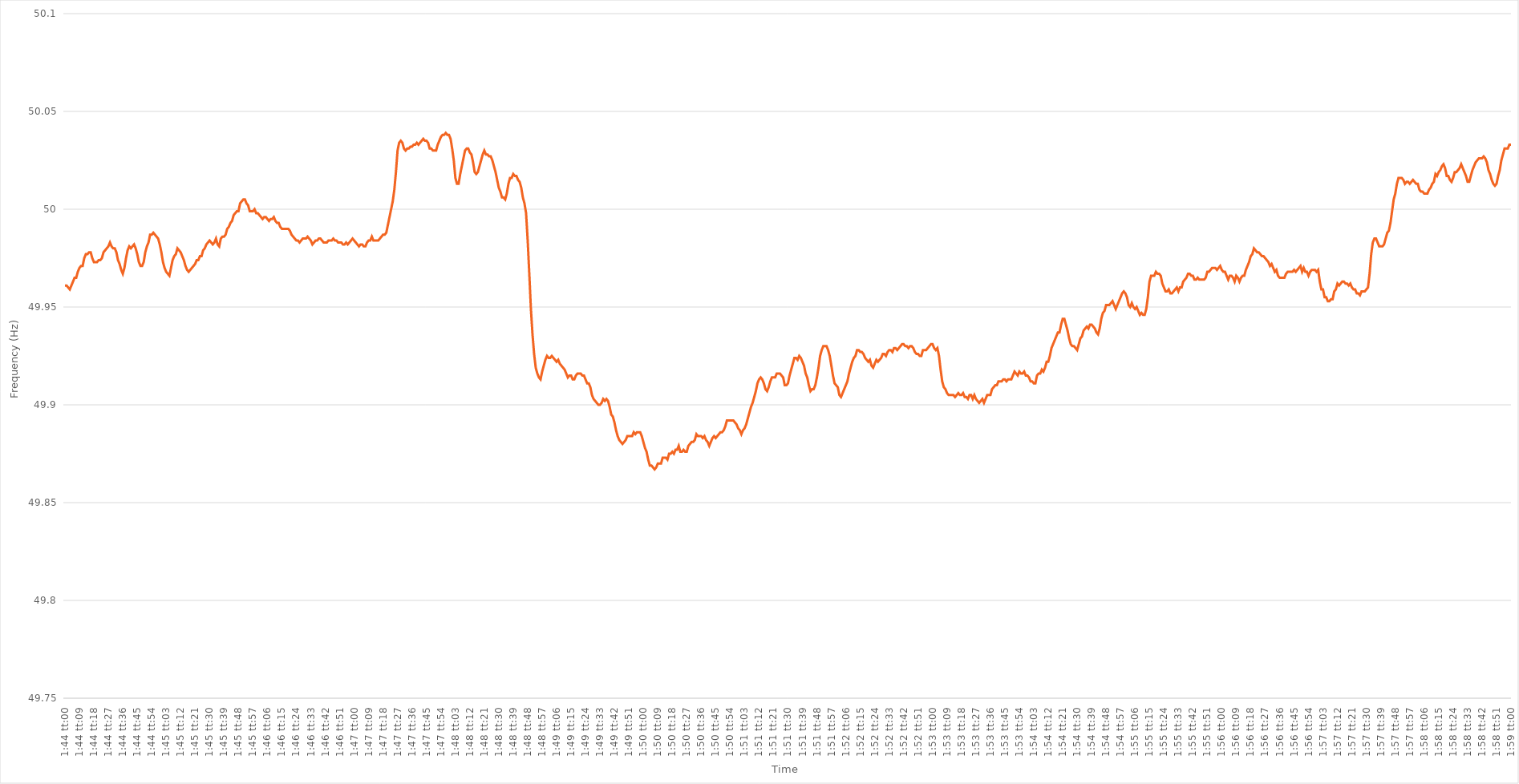
| Category | Series 0 |
|---|---|
| 0.07222222222222223 | 49.961 |
| 0.0722337962962963 | 49.961 |
| 0.07224537037037036 | 49.96 |
| 0.07225694444444444 | 49.959 |
| 0.07226851851851852 | 49.961 |
| 0.07228009259259259 | 49.963 |
| 0.07229166666666666 | 49.965 |
| 0.07230324074074074 | 49.965 |
| 0.07231481481481482 | 49.968 |
| 0.07232638888888888 | 49.97 |
| 0.07233796296296297 | 49.971 |
| 0.07234953703703705 | 49.971 |
| 0.07236111111111111 | 49.975 |
| 0.07237268518518519 | 49.977 |
| 0.07238425925925926 | 49.977 |
| 0.07239583333333334 | 49.978 |
| 0.0724074074074074 | 49.978 |
| 0.07241898148148147 | 49.975 |
| 0.07243055555555555 | 49.973 |
| 0.07244212962962963 | 49.973 |
| 0.0724537037037037 | 49.973 |
| 0.07246527777777778 | 49.974 |
| 0.07247685185185186 | 49.974 |
| 0.07248842592592593 | 49.975 |
| 0.0725 | 49.978 |
| 0.07251157407407406 | 49.979 |
| 0.07252314814814814 | 49.98 |
| 0.07253472222222222 | 49.981 |
| 0.07254629629629629 | 49.983 |
| 0.07255787037037037 | 49.981 |
| 0.07256944444444445 | 49.98 |
| 0.07258101851851852 | 49.98 |
| 0.0725925925925926 | 49.978 |
| 0.07260416666666666 | 49.974 |
| 0.07261574074074074 | 49.972 |
| 0.07262731481481481 | 49.969 |
| 0.07263888888888889 | 49.967 |
| 0.07265046296296296 | 49.97 |
| 0.07266203703703704 | 49.975 |
| 0.0726736111111111 | 49.979 |
| 0.07268518518518519 | 49.981 |
| 0.07269675925925927 | 49.98 |
| 0.07270833333333333 | 49.981 |
| 0.07271990740740741 | 49.982 |
| 0.07273148148148148 | 49.98 |
| 0.07274305555555556 | 49.977 |
| 0.07275462962962963 | 49.973 |
| 0.0727662037037037 | 49.971 |
| 0.07277777777777777 | 49.971 |
| 0.07278935185185186 | 49.973 |
| 0.07280092592592592 | 49.978 |
| 0.0728125 | 49.981 |
| 0.07282407407407408 | 49.983 |
| 0.07283564814814815 | 49.987 |
| 0.07284722222222222 | 49.987 |
| 0.0728587962962963 | 49.988 |
| 0.07287037037037036 | 49.987 |
| 0.07288194444444444 | 49.986 |
| 0.07289351851851851 | 49.985 |
| 0.07290509259259259 | 49.982 |
| 0.07291666666666667 | 49.978 |
| 0.07292824074074074 | 49.973 |
| 0.07293981481481482 | 49.97 |
| 0.07295138888888889 | 49.968 |
| 0.07296296296296297 | 49.967 |
| 0.07297453703703703 | 49.966 |
| 0.07298611111111111 | 49.97 |
| 0.07299768518518518 | 49.974 |
| 0.07300925925925926 | 49.976 |
| 0.07302083333333333 | 49.977 |
| 0.07303240740740741 | 49.98 |
| 0.07304398148148149 | 49.979 |
| 0.07305555555555555 | 49.978 |
| 0.07306712962962963 | 49.976 |
| 0.07307870370370372 | 49.974 |
| 0.07309027777777778 | 49.971 |
| 0.07310185185185185 | 49.969 |
| 0.07311342592592592 | 49.968 |
| 0.073125 | 49.969 |
| 0.07313657407407408 | 49.97 |
| 0.07314814814814814 | 49.971 |
| 0.07315972222222222 | 49.972 |
| 0.0731712962962963 | 49.974 |
| 0.07318287037037037 | 49.974 |
| 0.07319444444444444 | 49.976 |
| 0.07320601851851852 | 49.976 |
| 0.07321759259259258 | 49.979 |
| 0.07322916666666666 | 49.98 |
| 0.07324074074074073 | 49.982 |
| 0.07325231481481481 | 49.983 |
| 0.07326388888888889 | 49.984 |
| 0.07327546296296296 | 49.983 |
| 0.07328703703703704 | 49.982 |
| 0.07329861111111112 | 49.983 |
| 0.07331018518518519 | 49.985 |
| 0.07332175925925927 | 49.982 |
| 0.07333333333333333 | 49.981 |
| 0.07334490740740741 | 49.985 |
| 0.07335648148148148 | 49.986 |
| 0.07336805555555555 | 49.986 |
| 0.07337962962962963 | 49.987 |
| 0.07339120370370371 | 49.99 |
| 0.07340277777777778 | 49.991 |
| 0.07341435185185186 | 49.993 |
| 0.07342592592592594 | 49.994 |
| 0.0734375 | 49.997 |
| 0.07344907407407407 | 49.998 |
| 0.07346064814814814 | 49.999 |
| 0.07347222222222222 | 49.999 |
| 0.0734837962962963 | 50.003 |
| 0.07349537037037036 | 50.004 |
| 0.07350694444444444 | 50.005 |
| 0.07351851851851852 | 50.005 |
| 0.07353009259259259 | 50.003 |
| 0.07354166666666667 | 50.002 |
| 0.07355324074074074 | 49.999 |
| 0.07356481481481482 | 49.999 |
| 0.07357638888888889 | 49.999 |
| 0.07358796296296297 | 50 |
| 0.07359953703703703 | 49.998 |
| 0.07361111111111111 | 49.998 |
| 0.07362268518518518 | 49.997 |
| 0.07363425925925926 | 49.996 |
| 0.07364583333333334 | 49.995 |
| 0.07365740740740741 | 49.996 |
| 0.07366898148148149 | 49.996 |
| 0.07368055555555555 | 49.995 |
| 0.07369212962962964 | 49.994 |
| 0.0737037037037037 | 49.995 |
| 0.07371527777777777 | 49.995 |
| 0.07372685185185185 | 49.996 |
| 0.07373842592592593 | 49.994 |
| 0.07375 | 49.993 |
| 0.07376157407407408 | 49.993 |
| 0.07377314814814816 | 49.991 |
| 0.07378472222222222 | 49.99 |
| 0.07379629629629629 | 49.99 |
| 0.07380787037037037 | 49.99 |
| 0.07381944444444444 | 49.99 |
| 0.07383101851851852 | 49.99 |
| 0.07384259259259258 | 49.989 |
| 0.07385416666666667 | 49.987 |
| 0.07386574074074075 | 49.986 |
| 0.07387731481481481 | 49.985 |
| 0.07388888888888889 | 49.984 |
| 0.07390046296296296 | 49.984 |
| 0.07391203703703704 | 49.983 |
| 0.0739236111111111 | 49.984 |
| 0.07393518518518519 | 49.985 |
| 0.07394675925925925 | 49.985 |
| 0.07395833333333333 | 49.985 |
| 0.0739699074074074 | 49.986 |
| 0.07398148148148148 | 49.985 |
| 0.07399305555555556 | 49.984 |
| 0.07400462962962963 | 49.982 |
| 0.07401620370370371 | 49.983 |
| 0.07402777777777779 | 49.984 |
| 0.07403935185185186 | 49.984 |
| 0.07405092592592592 | 49.985 |
| 0.07406249999999999 | 49.985 |
| 0.07407407407407407 | 49.984 |
| 0.07408564814814815 | 49.983 |
| 0.07409722222222222 | 49.983 |
| 0.0741087962962963 | 49.983 |
| 0.07412037037037038 | 49.984 |
| 0.07413194444444444 | 49.984 |
| 0.07414351851851851 | 49.984 |
| 0.07415509259259259 | 49.985 |
| 0.07416666666666666 | 49.984 |
| 0.07417824074074074 | 49.984 |
| 0.0741898148148148 | 49.983 |
| 0.07420138888888889 | 49.983 |
| 0.07421296296296297 | 49.983 |
| 0.07422453703703703 | 49.982 |
| 0.07423611111111111 | 49.982 |
| 0.0742476851851852 | 49.983 |
| 0.07425925925925926 | 49.982 |
| 0.07427083333333334 | 49.983 |
| 0.07428240740740741 | 49.984 |
| 0.07429398148148149 | 49.985 |
| 0.07430555555555556 | 49.984 |
| 0.07431712962962962 | 49.983 |
| 0.0743287037037037 | 49.982 |
| 0.07434027777777778 | 49.981 |
| 0.07435185185185185 | 49.982 |
| 0.07436342592592593 | 49.982 |
| 0.07437500000000001 | 49.981 |
| 0.07438657407407408 | 49.981 |
| 0.07439814814814814 | 49.983 |
| 0.07440972222222221 | 49.984 |
| 0.07442129629629629 | 49.984 |
| 0.07443287037037037 | 49.986 |
| 0.07444444444444444 | 49.984 |
| 0.07445601851851852 | 49.984 |
| 0.0744675925925926 | 49.984 |
| 0.07447916666666667 | 49.984 |
| 0.07449074074074075 | 49.985 |
| 0.07450231481481481 | 49.986 |
| 0.0745138888888889 | 49.987 |
| 0.07452546296296296 | 49.987 |
| 0.07453703703703704 | 49.988 |
| 0.07454861111111111 | 49.992 |
| 0.07456018518518519 | 49.996 |
| 0.07457175925925925 | 50 |
| 0.07458333333333333 | 50.004 |
| 0.07459490740740742 | 50.01 |
| 0.07460648148148148 | 50.019 |
| 0.07461805555555556 | 50.03 |
| 0.07462962962962963 | 50.034 |
| 0.07464120370370371 | 50.035 |
| 0.07465277777777778 | 50.034 |
| 0.07466435185185184 | 50.031 |
| 0.07467592592592592 | 50.03 |
| 0.0746875 | 50.031 |
| 0.07469907407407407 | 50.031 |
| 0.07471064814814815 | 50.032 |
| 0.07472222222222223 | 50.032 |
| 0.0747337962962963 | 50.033 |
| 0.07474537037037036 | 50.033 |
| 0.07475694444444445 | 50.034 |
| 0.07476851851851851 | 50.033 |
| 0.07478009259259259 | 50.034 |
| 0.07479166666666666 | 50.035 |
| 0.07480324074074074 | 50.036 |
| 0.07481481481481482 | 50.035 |
| 0.07482638888888889 | 50.035 |
| 0.07483796296296297 | 50.034 |
| 0.07484953703703703 | 50.031 |
| 0.07486111111111111 | 50.031 |
| 0.07487268518518518 | 50.03 |
| 0.07488425925925926 | 50.03 |
| 0.07489583333333333 | 50.03 |
| 0.07490740740740741 | 50.033 |
| 0.07491898148148148 | 50.035 |
| 0.07493055555555556 | 50.037 |
| 0.07494212962962964 | 50.038 |
| 0.0749537037037037 | 50.038 |
| 0.07496527777777778 | 50.039 |
| 0.07497685185185186 | 50.038 |
| 0.07498842592592593 | 50.038 |
| 0.075 | 50.036 |
| 0.07501157407407406 | 50.031 |
| 0.07502314814814814 | 50.025 |
| 0.07503472222222222 | 50.016 |
| 0.07504629629629629 | 50.013 |
| 0.07505787037037037 | 50.013 |
| 0.07506944444444445 | 50.018 |
| 0.07508101851851852 | 50.022 |
| 0.07509259259259259 | 50.026 |
| 0.07510416666666667 | 50.03 |
| 0.07511574074074073 | 50.031 |
| 0.07512731481481481 | 50.031 |
| 0.07513888888888888 | 50.029 |
| 0.07515046296296296 | 50.028 |
| 0.07516203703703704 | 50.024 |
| 0.07517361111111111 | 50.019 |
| 0.07518518518518519 | 50.018 |
| 0.07519675925925927 | 50.019 |
| 0.07520833333333334 | 50.022 |
| 0.07521990740740742 | 50.025 |
| 0.07523148148148148 | 50.028 |
| 0.07524305555555556 | 50.03 |
| 0.07525462962962963 | 50.028 |
| 0.0752662037037037 | 50.028 |
| 0.07527777777777778 | 50.027 |
| 0.07528935185185186 | 50.027 |
| 0.07530092592592592 | 50.025 |
| 0.0753125 | 50.022 |
| 0.07532407407407408 | 50.019 |
| 0.07533564814814815 | 50.015 |
| 0.07534722222222222 | 50.011 |
| 0.07535879629629628 | 50.009 |
| 0.07537037037037037 | 50.006 |
| 0.07538194444444445 | 50.006 |
| 0.07539351851851851 | 50.005 |
| 0.07540509259259259 | 50.008 |
| 0.07541666666666667 | 50.013 |
| 0.07542824074074074 | 50.016 |
| 0.07543981481481482 | 50.016 |
| 0.07545138888888889 | 50.018 |
| 0.07546296296296297 | 50.017 |
| 0.07547453703703703 | 50.017 |
| 0.07548611111111111 | 50.015 |
| 0.07549768518518518 | 50.014 |
| 0.07550925925925926 | 50.011 |
| 0.07552083333333333 | 50.006 |
| 0.07553240740740741 | 50.003 |
| 0.07554398148148149 | 49.998 |
| 0.07555555555555556 | 49.984 |
| 0.07556712962962964 | 49.967 |
| 0.0755787037037037 | 49.949 |
| 0.07559027777777778 | 49.936 |
| 0.07560185185185185 | 49.926 |
| 0.07561342592592592 | 49.919 |
| 0.075625 | 49.916 |
| 0.07563657407407408 | 49.914 |
| 0.07564814814814814 | 49.913 |
| 0.07565972222222223 | 49.917 |
| 0.0756712962962963 | 49.92 |
| 0.07568287037037037 | 49.923 |
| 0.07569444444444444 | 49.925 |
| 0.07570601851851852 | 49.924 |
| 0.07571759259259259 | 49.924 |
| 0.07572916666666667 | 49.925 |
| 0.07574074074074073 | 49.924 |
| 0.07575231481481481 | 49.923 |
| 0.0757638888888889 | 49.922 |
| 0.07577546296296296 | 49.923 |
| 0.07578703703703704 | 49.921 |
| 0.07579861111111111 | 49.92 |
| 0.07581018518518519 | 49.919 |
| 0.07582175925925926 | 49.918 |
| 0.07583333333333334 | 49.916 |
| 0.0758449074074074 | 49.914 |
| 0.07585648148148148 | 49.915 |
| 0.07586805555555555 | 49.915 |
| 0.07587962962962963 | 49.913 |
| 0.07589120370370371 | 49.913 |
| 0.07590277777777778 | 49.915 |
| 0.07591435185185186 | 49.916 |
| 0.07592592592592594 | 49.916 |
| 0.0759375 | 49.916 |
| 0.07594907407407407 | 49.915 |
| 0.07596064814814814 | 49.915 |
| 0.07597222222222222 | 49.913 |
| 0.0759837962962963 | 49.911 |
| 0.07599537037037037 | 49.911 |
| 0.07600694444444445 | 49.909 |
| 0.07601851851851853 | 49.905 |
| 0.0760300925925926 | 49.903 |
| 0.07604166666666666 | 49.902 |
| 0.07605324074074074 | 49.901 |
| 0.07606481481481481 | 49.9 |
| 0.07607638888888889 | 49.9 |
| 0.07608796296296295 | 49.901 |
| 0.07609953703703703 | 49.903 |
| 0.07611111111111112 | 49.902 |
| 0.07612268518518518 | 49.903 |
| 0.07613425925925926 | 49.902 |
| 0.07614583333333334 | 49.899 |
| 0.07615740740740741 | 49.895 |
| 0.07616898148148148 | 49.894 |
| 0.07618055555555556 | 49.891 |
| 0.07619212962962964 | 49.887 |
| 0.0762037037037037 | 49.884 |
| 0.07621527777777777 | 49.882 |
| 0.07622685185185185 | 49.881 |
| 0.07623842592592593 | 49.88 |
| 0.07625 | 49.881 |
| 0.07626157407407408 | 49.882 |
| 0.07627314814814816 | 49.884 |
| 0.07628472222222223 | 49.884 |
| 0.07629629629629629 | 49.884 |
| 0.07630787037037036 | 49.884 |
| 0.07631944444444444 | 49.886 |
| 0.07633101851851852 | 49.885 |
| 0.07634259259259259 | 49.886 |
| 0.07635416666666667 | 49.886 |
| 0.07636574074074075 | 49.886 |
| 0.07637731481481481 | 49.884 |
| 0.0763888888888889 | 49.881 |
| 0.07640046296296296 | 49.878 |
| 0.07641203703703704 | 49.876 |
| 0.07642361111111111 | 49.872 |
| 0.07643518518518519 | 49.869 |
| 0.07644675925925926 | 49.869 |
| 0.07645833333333334 | 49.868 |
| 0.0764699074074074 | 49.867 |
| 0.07648148148148148 | 49.868 |
| 0.07649305555555556 | 49.87 |
| 0.07650462962962963 | 49.87 |
| 0.0765162037037037 | 49.87 |
| 0.07652777777777778 | 49.873 |
| 0.07653935185185186 | 49.873 |
| 0.07655092592592593 | 49.873 |
| 0.07656249999999999 | 49.872 |
| 0.07657407407407407 | 49.875 |
| 0.07658564814814815 | 49.875 |
| 0.07659722222222222 | 49.876 |
| 0.0766087962962963 | 49.875 |
| 0.07662037037037038 | 49.877 |
| 0.07663194444444445 | 49.877 |
| 0.07664351851851851 | 49.879 |
| 0.0766550925925926 | 49.876 |
| 0.07666666666666666 | 49.876 |
| 0.07667824074074074 | 49.877 |
| 0.07668981481481481 | 49.876 |
| 0.07670138888888889 | 49.876 |
| 0.07671296296296297 | 49.879 |
| 0.07672453703703704 | 49.88 |
| 0.07673611111111112 | 49.881 |
| 0.07674768518518518 | 49.881 |
| 0.07675925925925926 | 49.882 |
| 0.07677083333333333 | 49.885 |
| 0.07678240740740741 | 49.884 |
| 0.07679398148148148 | 49.884 |
| 0.07680555555555556 | 49.884 |
| 0.07681712962962962 | 49.883 |
| 0.0768287037037037 | 49.884 |
| 0.07684027777777779 | 49.882 |
| 0.07685185185185185 | 49.881 |
| 0.07686342592592592 | 49.879 |
| 0.07687500000000001 | 49.881 |
| 0.07688657407407408 | 49.883 |
| 0.07689814814814815 | 49.884 |
| 0.07690972222222221 | 49.883 |
| 0.0769212962962963 | 49.884 |
| 0.07693287037037037 | 49.885 |
| 0.07694444444444444 | 49.886 |
| 0.07695601851851852 | 49.886 |
| 0.0769675925925926 | 49.887 |
| 0.07697916666666667 | 49.889 |
| 0.07699074074074073 | 49.892 |
| 0.07700231481481482 | 49.892 |
| 0.07701388888888888 | 49.892 |
| 0.07702546296296296 | 49.892 |
| 0.07703703703703703 | 49.892 |
| 0.07704861111111111 | 49.891 |
| 0.07706018518518519 | 49.89 |
| 0.07707175925925926 | 49.888 |
| 0.07708333333333334 | 49.887 |
| 0.07709490740740742 | 49.885 |
| 0.07710648148148148 | 49.887 |
| 0.07711805555555555 | 49.888 |
| 0.07712962962962963 | 49.89 |
| 0.07714120370370371 | 49.893 |
| 0.07715277777777778 | 49.896 |
| 0.07716435185185185 | 49.899 |
| 0.07717592592592593 | 49.901 |
| 0.0771875 | 49.904 |
| 0.07719907407407407 | 49.907 |
| 0.07721064814814814 | 49.911 |
| 0.07722222222222223 | 49.913 |
| 0.0772337962962963 | 49.914 |
| 0.07724537037037037 | 49.913 |
| 0.07725694444444443 | 49.911 |
| 0.07726851851851851 | 49.908 |
| 0.0772800925925926 | 49.907 |
| 0.07729166666666666 | 49.909 |
| 0.07730324074074074 | 49.912 |
| 0.07731481481481482 | 49.914 |
| 0.07732638888888889 | 49.914 |
| 0.07733796296296297 | 49.914 |
| 0.07734953703703704 | 49.916 |
| 0.07736111111111112 | 49.916 |
| 0.07737268518518518 | 49.916 |
| 0.07738425925925925 | 49.915 |
| 0.07739583333333333 | 49.914 |
| 0.07740740740740741 | 49.91 |
| 0.07741898148148148 | 49.91 |
| 0.07743055555555556 | 49.911 |
| 0.07744212962962964 | 49.915 |
| 0.0774537037037037 | 49.918 |
| 0.07746527777777777 | 49.921 |
| 0.07747685185185185 | 49.924 |
| 0.07748842592592593 | 49.924 |
| 0.0775 | 49.923 |
| 0.07751157407407407 | 49.925 |
| 0.07752314814814815 | 49.924 |
| 0.07753472222222223 | 49.922 |
| 0.0775462962962963 | 49.92 |
| 0.07755787037037037 | 49.916 |
| 0.07756944444444445 | 49.914 |
| 0.07758101851851852 | 49.91 |
| 0.07759259259259259 | 49.907 |
| 0.07760416666666667 | 49.908 |
| 0.07761574074074074 | 49.908 |
| 0.07762731481481482 | 49.91 |
| 0.07763888888888888 | 49.914 |
| 0.07765046296296296 | 49.919 |
| 0.07766203703703704 | 49.925 |
| 0.07767361111111111 | 49.928 |
| 0.07768518518518519 | 49.93 |
| 0.07769675925925926 | 49.93 |
| 0.07770833333333334 | 49.93 |
| 0.0777199074074074 | 49.928 |
| 0.07773148148148147 | 49.925 |
| 0.07774305555555555 | 49.92 |
| 0.07775462962962963 | 49.915 |
| 0.0777662037037037 | 49.911 |
| 0.07777777777777778 | 49.91 |
| 0.07778935185185186 | 49.909 |
| 0.07780092592592593 | 49.905 |
| 0.07781249999999999 | 49.904 |
| 0.07782407407407409 | 49.906 |
| 0.07783564814814815 | 49.908 |
| 0.07784722222222222 | 49.91 |
| 0.07785879629629629 | 49.912 |
| 0.07787037037037037 | 49.916 |
| 0.07788194444444445 | 49.919 |
| 0.07789351851851851 | 49.922 |
| 0.0779050925925926 | 49.924 |
| 0.07791666666666668 | 49.925 |
| 0.07792824074074074 | 49.928 |
| 0.07793981481481481 | 49.928 |
| 0.07795138888888889 | 49.927 |
| 0.07796296296296296 | 49.927 |
| 0.07797453703703704 | 49.926 |
| 0.0779861111111111 | 49.924 |
| 0.07799768518518518 | 49.923 |
| 0.07800925925925926 | 49.922 |
| 0.07802083333333333 | 49.923 |
| 0.07803240740740741 | 49.92 |
| 0.07804398148148149 | 49.919 |
| 0.07805555555555556 | 49.921 |
| 0.07806712962962963 | 49.923 |
| 0.07807870370370369 | 49.922 |
| 0.07809027777777779 | 49.923 |
| 0.07810185185185185 | 49.924 |
| 0.07811342592592592 | 49.926 |
| 0.078125 | 49.926 |
| 0.07813657407407408 | 49.925 |
| 0.07814814814814815 | 49.927 |
| 0.07815972222222221 | 49.928 |
| 0.07817129629629631 | 49.928 |
| 0.07818287037037037 | 49.927 |
| 0.07819444444444444 | 49.929 |
| 0.07820601851851851 | 49.929 |
| 0.07821759259259259 | 49.928 |
| 0.07822916666666667 | 49.929 |
| 0.07824074074074074 | 49.93 |
| 0.07825231481481482 | 49.931 |
| 0.0782638888888889 | 49.931 |
| 0.07827546296296296 | 49.93 |
| 0.07828703703703704 | 49.93 |
| 0.07829861111111111 | 49.929 |
| 0.07831018518518519 | 49.93 |
| 0.07832175925925926 | 49.93 |
| 0.07833333333333332 | 49.929 |
| 0.0783449074074074 | 49.927 |
| 0.07835648148148149 | 49.926 |
| 0.07836805555555555 | 49.926 |
| 0.07837962962962963 | 49.925 |
| 0.07839120370370371 | 49.925 |
| 0.07840277777777778 | 49.928 |
| 0.07841435185185185 | 49.928 |
| 0.07842592592592591 | 49.928 |
| 0.07843750000000001 | 49.929 |
| 0.07844907407407407 | 49.93 |
| 0.07846064814814814 | 49.931 |
| 0.07847222222222222 | 49.931 |
| 0.0784837962962963 | 49.929 |
| 0.07849537037037037 | 49.928 |
| 0.07850694444444445 | 49.929 |
| 0.07851851851851853 | 49.925 |
| 0.0785300925925926 | 49.918 |
| 0.07854166666666666 | 49.912 |
| 0.07855324074074074 | 49.909 |
| 0.07856481481481481 | 49.908 |
| 0.07857638888888889 | 49.906 |
| 0.07858796296296296 | 49.905 |
| 0.07859953703703704 | 49.905 |
| 0.07861111111111112 | 49.905 |
| 0.07862268518518518 | 49.905 |
| 0.07863425925925926 | 49.904 |
| 0.07864583333333333 | 49.905 |
| 0.07865740740740741 | 49.906 |
| 0.07866898148148148 | 49.905 |
| 0.07868055555555555 | 49.905 |
| 0.07869212962962963 | 49.906 |
| 0.0787037037037037 | 49.904 |
| 0.07871527777777777 | 49.904 |
| 0.07872685185185185 | 49.903 |
| 0.07873842592592593 | 49.905 |
| 0.07875 | 49.905 |
| 0.07876157407407407 | 49.903 |
| 0.07877314814814815 | 49.905 |
| 0.07878472222222223 | 49.903 |
| 0.0787962962962963 | 49.902 |
| 0.07880787037037036 | 49.901 |
| 0.07881944444444444 | 49.902 |
| 0.07883101851851852 | 49.903 |
| 0.07884259259259259 | 49.901 |
| 0.07885416666666667 | 49.903 |
| 0.07886574074074075 | 49.905 |
| 0.07887731481481482 | 49.905 |
| 0.07888888888888888 | 49.905 |
| 0.07890046296296296 | 49.908 |
| 0.07891203703703703 | 49.909 |
| 0.07892361111111111 | 49.91 |
| 0.07893518518518518 | 49.91 |
| 0.07894675925925926 | 49.912 |
| 0.07895833333333334 | 49.912 |
| 0.0789699074074074 | 49.912 |
| 0.07898148148148149 | 49.913 |
| 0.07899305555555557 | 49.913 |
| 0.07900462962962963 | 49.912 |
| 0.0790162037037037 | 49.913 |
| 0.07902777777777777 | 49.913 |
| 0.07903935185185186 | 49.913 |
| 0.07905092592592593 | 49.915 |
| 0.0790625 | 49.917 |
| 0.07907407407407407 | 49.916 |
| 0.07908564814814815 | 49.915 |
| 0.07909722222222222 | 49.917 |
| 0.07910879629629629 | 49.916 |
| 0.07912037037037037 | 49.916 |
| 0.07913194444444445 | 49.917 |
| 0.07914351851851852 | 49.915 |
| 0.07915509259259258 | 49.915 |
| 0.07916666666666666 | 49.914 |
| 0.07917824074074074 | 49.912 |
| 0.07918981481481481 | 49.912 |
| 0.07920138888888889 | 49.911 |
| 0.07921296296296297 | 49.911 |
| 0.07922453703703704 | 49.915 |
| 0.07923611111111112 | 49.916 |
| 0.07924768518518518 | 49.916 |
| 0.07925925925925927 | 49.918 |
| 0.07927083333333333 | 49.917 |
| 0.0792824074074074 | 49.919 |
| 0.07929398148148148 | 49.922 |
| 0.07930555555555556 | 49.922 |
| 0.07931712962962963 | 49.925 |
| 0.0793287037037037 | 49.929 |
| 0.07934027777777779 | 49.931 |
| 0.07935185185185185 | 49.933 |
| 0.07936342592592592 | 49.935 |
| 0.07937499999999999 | 49.937 |
| 0.07938657407407408 | 49.937 |
| 0.07939814814814815 | 49.941 |
| 0.07940972222222221 | 49.944 |
| 0.0794212962962963 | 49.944 |
| 0.07943287037037038 | 49.941 |
| 0.07944444444444444 | 49.938 |
| 0.07945601851851852 | 49.934 |
| 0.07946759259259259 | 49.931 |
| 0.07947916666666667 | 49.93 |
| 0.07949074074074074 | 49.93 |
| 0.07950231481481482 | 49.929 |
| 0.07951388888888888 | 49.928 |
| 0.07952546296296296 | 49.931 |
| 0.07953703703703703 | 49.934 |
| 0.07954861111111111 | 49.935 |
| 0.07956018518518519 | 49.938 |
| 0.07957175925925926 | 49.939 |
| 0.07958333333333334 | 49.94 |
| 0.0795949074074074 | 49.939 |
| 0.07960648148148149 | 49.941 |
| 0.07961805555555555 | 49.941 |
| 0.07962962962962962 | 49.94 |
| 0.0796412037037037 | 49.939 |
| 0.07965277777777778 | 49.937 |
| 0.07966435185185185 | 49.936 |
| 0.07967592592592593 | 49.939 |
| 0.07968750000000001 | 49.944 |
| 0.07969907407407407 | 49.947 |
| 0.07971064814814814 | 49.948 |
| 0.07972222222222222 | 49.951 |
| 0.0797337962962963 | 49.951 |
| 0.07974537037037037 | 49.951 |
| 0.07975694444444444 | 49.952 |
| 0.07976851851851852 | 49.953 |
| 0.0797800925925926 | 49.951 |
| 0.07979166666666666 | 49.949 |
| 0.07980324074074074 | 49.951 |
| 0.07981481481481481 | 49.953 |
| 0.07982638888888889 | 49.955 |
| 0.07983796296296296 | 49.957 |
| 0.07984953703703704 | 49.958 |
| 0.0798611111111111 | 49.957 |
| 0.07987268518518519 | 49.955 |
| 0.07988425925925925 | 49.951 |
| 0.07989583333333333 | 49.95 |
| 0.07990740740740741 | 49.952 |
| 0.07991898148148148 | 49.95 |
| 0.07993055555555556 | 49.949 |
| 0.07994212962962964 | 49.95 |
| 0.07995370370370371 | 49.948 |
| 0.07996527777777777 | 49.946 |
| 0.07997685185185184 | 49.947 |
| 0.07998842592592592 | 49.946 |
| 0.08 | 49.946 |
| 0.08001157407407407 | 49.949 |
| 0.08002314814814815 | 49.955 |
| 0.08003472222222223 | 49.963 |
| 0.0800462962962963 | 49.966 |
| 0.08005787037037036 | 49.966 |
| 0.08006944444444444 | 49.966 |
| 0.08008101851851852 | 49.968 |
| 0.08009259259259259 | 49.967 |
| 0.08010416666666666 | 49.967 |
| 0.08011574074074074 | 49.966 |
| 0.08012731481481482 | 49.962 |
| 0.08013888888888888 | 49.96 |
| 0.08015046296296297 | 49.958 |
| 0.08016203703703705 | 49.958 |
| 0.08017361111111111 | 49.959 |
| 0.08018518518518519 | 49.957 |
| 0.08019675925925926 | 49.957 |
| 0.08020833333333334 | 49.958 |
| 0.0802199074074074 | 49.959 |
| 0.08023148148148147 | 49.96 |
| 0.08024305555555555 | 49.958 |
| 0.08025462962962963 | 49.96 |
| 0.0802662037037037 | 49.96 |
| 0.08027777777777778 | 49.963 |
| 0.08028935185185186 | 49.964 |
| 0.08030092592592593 | 49.965 |
| 0.0803125 | 49.967 |
| 0.08032407407407406 | 49.967 |
| 0.08033564814814814 | 49.966 |
| 0.08034722222222222 | 49.966 |
| 0.08035879629629629 | 49.964 |
| 0.08037037037037037 | 49.964 |
| 0.08038194444444445 | 49.965 |
| 0.08039351851851852 | 49.964 |
| 0.0804050925925926 | 49.964 |
| 0.08041666666666666 | 49.964 |
| 0.08042824074074074 | 49.964 |
| 0.08043981481481481 | 49.965 |
| 0.08045138888888889 | 49.968 |
| 0.08046296296296296 | 49.968 |
| 0.08047453703703704 | 49.969 |
| 0.0804861111111111 | 49.97 |
| 0.08049768518518519 | 49.97 |
| 0.08050925925925927 | 49.97 |
| 0.08052083333333333 | 49.969 |
| 0.08053240740740741 | 49.97 |
| 0.08054398148148148 | 49.971 |
| 0.08055555555555556 | 49.969 |
| 0.08056712962962963 | 49.968 |
| 0.0805787037037037 | 49.968 |
| 0.08059027777777777 | 49.966 |
| 0.08060185185185186 | 49.964 |
| 0.08061342592592592 | 49.966 |
| 0.080625 | 49.966 |
| 0.08063657407407408 | 49.965 |
| 0.08064814814814815 | 49.963 |
| 0.08065972222222222 | 49.966 |
| 0.0806712962962963 | 49.965 |
| 0.08068287037037036 | 49.963 |
| 0.08069444444444444 | 49.965 |
| 0.08070601851851851 | 49.966 |
| 0.08071759259259259 | 49.966 |
| 0.08072916666666667 | 49.969 |
| 0.08074074074074074 | 49.971 |
| 0.08075231481481482 | 49.973 |
| 0.08076388888888889 | 49.976 |
| 0.08077546296296297 | 49.977 |
| 0.08078703703703703 | 49.98 |
| 0.08079861111111111 | 49.979 |
| 0.08081018518518518 | 49.978 |
| 0.08082175925925926 | 49.978 |
| 0.08083333333333333 | 49.977 |
| 0.08084490740740741 | 49.976 |
| 0.08085648148148149 | 49.976 |
| 0.08086805555555555 | 49.975 |
| 0.08087962962962963 | 49.974 |
| 0.08089120370370372 | 49.973 |
| 0.08090277777777778 | 49.971 |
| 0.08091435185185185 | 49.972 |
| 0.08092592592592592 | 49.97 |
| 0.0809375 | 49.968 |
| 0.08094907407407408 | 49.969 |
| 0.08096064814814814 | 49.966 |
| 0.08097222222222222 | 49.965 |
| 0.0809837962962963 | 49.965 |
| 0.08099537037037037 | 49.965 |
| 0.08100694444444444 | 49.965 |
| 0.08101851851851852 | 49.967 |
| 0.08103009259259258 | 49.968 |
| 0.08104166666666666 | 49.968 |
| 0.08105324074074073 | 49.968 |
| 0.08106481481481481 | 49.968 |
| 0.08107638888888889 | 49.969 |
| 0.08108796296296296 | 49.968 |
| 0.08109953703703704 | 49.969 |
| 0.08111111111111112 | 49.97 |
| 0.08112268518518519 | 49.971 |
| 0.08113425925925927 | 49.968 |
| 0.08114583333333333 | 49.97 |
| 0.08115740740740741 | 49.968 |
| 0.08116898148148148 | 49.968 |
| 0.08118055555555555 | 49.966 |
| 0.08119212962962963 | 49.968 |
| 0.08120370370370371 | 49.969 |
| 0.08121527777777778 | 49.969 |
| 0.08122685185185186 | 49.969 |
| 0.08123842592592594 | 49.968 |
| 0.08125 | 49.969 |
| 0.08126157407407407 | 49.963 |
| 0.08127314814814814 | 49.959 |
| 0.08128472222222222 | 49.959 |
| 0.0812962962962963 | 49.955 |
| 0.08130787037037036 | 49.955 |
| 0.08131944444444444 | 49.953 |
| 0.08133101851851852 | 49.953 |
| 0.08134259259259259 | 49.954 |
| 0.08135416666666667 | 49.954 |
| 0.08136574074074074 | 49.958 |
| 0.08137731481481482 | 49.959 |
| 0.08138888888888889 | 49.962 |
| 0.08140046296296297 | 49.961 |
| 0.08141203703703703 | 49.962 |
| 0.08142361111111111 | 49.963 |
| 0.08143518518518518 | 49.963 |
| 0.08144675925925926 | 49.962 |
| 0.08145833333333334 | 49.962 |
| 0.08146990740740741 | 49.961 |
| 0.08148148148148149 | 49.962 |
| 0.08149305555555555 | 49.96 |
| 0.08150462962962964 | 49.959 |
| 0.0815162037037037 | 49.959 |
| 0.08152777777777777 | 49.957 |
| 0.08153935185185185 | 49.957 |
| 0.08155092592592593 | 49.956 |
| 0.0815625 | 49.958 |
| 0.08157407407407408 | 49.958 |
| 0.08158564814814816 | 49.958 |
| 0.08159722222222222 | 49.959 |
| 0.08160879629629629 | 49.96 |
| 0.08162037037037037 | 49.967 |
| 0.08163194444444444 | 49.977 |
| 0.08164351851851852 | 49.983 |
| 0.08165509259259258 | 49.985 |
| 0.08166666666666667 | 49.985 |
| 0.08167824074074075 | 49.983 |
| 0.08168981481481481 | 49.981 |
| 0.08170138888888889 | 49.981 |
| 0.08171296296296296 | 49.981 |
| 0.08172453703703704 | 49.982 |
| 0.0817361111111111 | 49.985 |
| 0.08174768518518519 | 49.988 |
| 0.08175925925925925 | 49.989 |
| 0.08177083333333333 | 49.993 |
| 0.0817824074074074 | 49.999 |
| 0.08179398148148148 | 50.005 |
| 0.08180555555555556 | 50.008 |
| 0.08181712962962963 | 50.013 |
| 0.08182870370370371 | 50.016 |
| 0.08184027777777779 | 50.016 |
| 0.08185185185185186 | 50.016 |
| 0.08186342592592592 | 50.015 |
| 0.08187499999999999 | 50.013 |
| 0.08188657407407407 | 50.014 |
| 0.08189814814814815 | 50.014 |
| 0.08190972222222222 | 50.013 |
| 0.0819212962962963 | 50.014 |
| 0.08193287037037038 | 50.015 |
| 0.08194444444444444 | 50.014 |
| 0.08195601851851851 | 50.013 |
| 0.08196759259259259 | 50.013 |
| 0.08197916666666666 | 50.01 |
| 0.08199074074074074 | 50.009 |
| 0.0820023148148148 | 50.009 |
| 0.08201388888888889 | 50.008 |
| 0.08202546296296297 | 50.008 |
| 0.08203703703703703 | 50.008 |
| 0.08204861111111111 | 50.01 |
| 0.0820601851851852 | 50.011 |
| 0.08207175925925926 | 50.013 |
| 0.08208333333333334 | 50.014 |
| 0.08209490740740741 | 50.018 |
| 0.08210648148148149 | 50.017 |
| 0.08211805555555556 | 50.019 |
| 0.08212962962962962 | 50.02 |
| 0.0821412037037037 | 50.022 |
| 0.08215277777777778 | 50.023 |
| 0.08216435185185185 | 50.021 |
| 0.08217592592592593 | 50.017 |
| 0.08218750000000001 | 50.017 |
| 0.08219907407407408 | 50.015 |
| 0.08221064814814814 | 50.014 |
| 0.08222222222222221 | 50.016 |
| 0.08223379629629629 | 50.019 |
| 0.08224537037037037 | 50.019 |
| 0.08225694444444444 | 50.02 |
| 0.08226851851851852 | 50.021 |
| 0.0822800925925926 | 50.023 |
| 0.08229166666666667 | 50.021 |
| 0.08230324074074075 | 50.019 |
| 0.08231481481481481 | 50.017 |
| 0.0823263888888889 | 50.014 |
| 0.08233796296296296 | 50.014 |
| 0.08234953703703704 | 50.017 |
| 0.08236111111111111 | 50.02 |
| 0.08237268518518519 | 50.022 |
| 0.08238425925925925 | 50.024 |
| 0.08239583333333333 | 50.025 |
| 0.08240740740740742 | 50.026 |
| 0.08241898148148148 | 50.026 |
| 0.08243055555555556 | 50.026 |
| 0.08244212962962963 | 50.027 |
| 0.08245370370370371 | 50.026 |
| 0.08246527777777778 | 50.024 |
| 0.08247685185185184 | 50.02 |
| 0.08248842592592592 | 50.018 |
| 0.0825 | 50.015 |
| 0.08251157407407407 | 50.013 |
| 0.08252314814814815 | 50.012 |
| 0.08253472222222223 | 50.013 |
| 0.0825462962962963 | 50.017 |
| 0.08255787037037036 | 50.02 |
| 0.08256944444444445 | 50.025 |
| 0.08258101851851851 | 50.028 |
| 0.08259259259259259 | 50.031 |
| 0.08260416666666666 | 50.031 |
| 0.08261574074074074 | 50.031 |
| 0.08262731481481482 | 50.033 |
| 0.08263888888888889 | 50.033 |